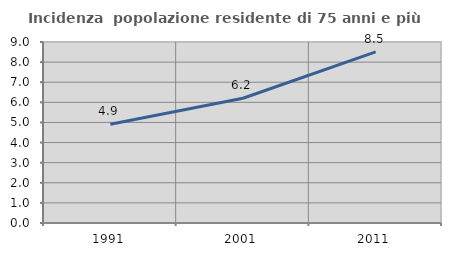
| Category | Incidenza  popolazione residente di 75 anni e più |
|---|---|
| 1991.0 | 4.907 |
| 2001.0 | 6.201 |
| 2011.0 | 8.506 |